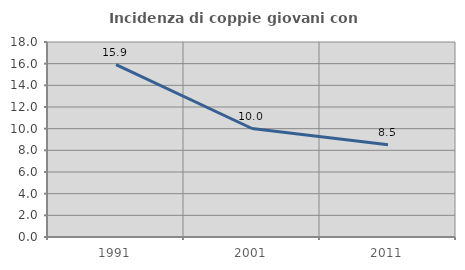
| Category | Incidenza di coppie giovani con figli |
|---|---|
| 1991.0 | 15.902 |
| 2001.0 | 10.014 |
| 2011.0 | 8.507 |